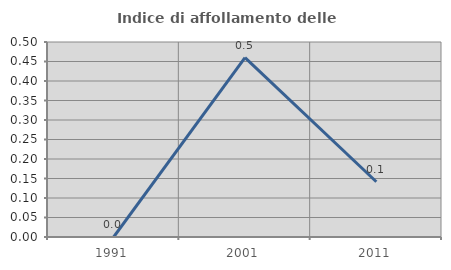
| Category | Indice di affollamento delle abitazioni  |
|---|---|
| 1991.0 | 0 |
| 2001.0 | 0.46 |
| 2011.0 | 0.142 |